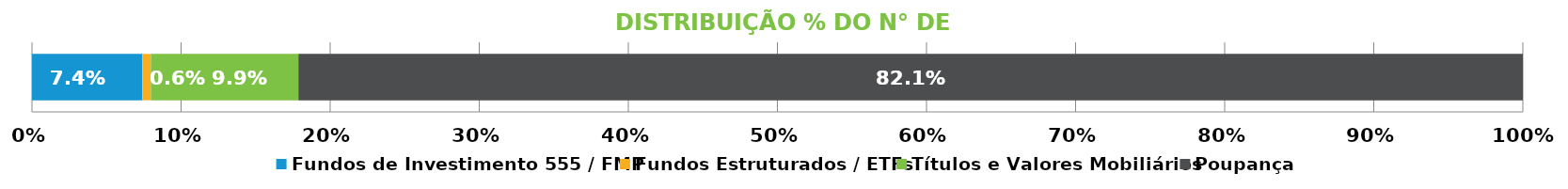
| Category | Fundos de Investimento 555 / FMP | Fundos Estruturados / ETFs | Títulos e Valores Mobiliários | Poupança |
|---|---|---|---|---|
| 0 | 0.074 | 0.006 | 0.099 | 0.821 |